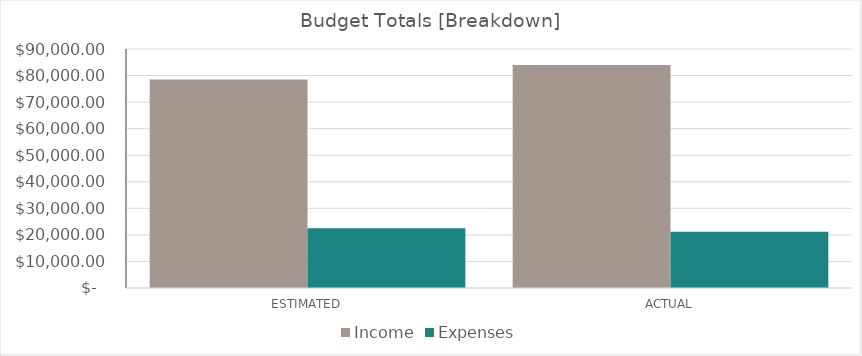
| Category | Income | Expenses |
|---|---|---|
| ESTIMATED | 78500 | 22500 |
| ACTUAL | 84000 | 21225 |